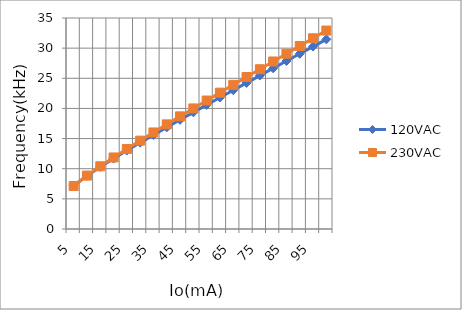
| Category | 120VAC | 230VAC |
|---|---|---|
| 5.0 | 7.177 | 7.134 |
| 10.0 | 8.828 | 8.86 |
| 15.0 | 10.298 | 10.405 |
| 20.0 | 11.683 | 11.866 |
| 25.0 | 13.018 | 13.277 |
| 30.0 | 14.32 | 14.657 |
| 35.0 | 15.599 | 16.014 |
| 40.0 | 16.861 | 17.354 |
| 45.0 | 18.111 | 18.683 |
| 50.0 | 19.35 | 20.001 |
| 55.0 | 20.581 | 21.312 |
| 60.0 | 21.806 | 22.616 |
| 65.0 | 23.025 | 23.915 |
| 70.0 | 24.239 | 25.21 |
| 75.0 | 25.45 | 26.501 |
| 80.0 | 26.657 | 27.789 |
| 85.0 | 27.861 | 29.074 |
| 90.0 | 29.063 | 30.357 |
| 95.0 | 30.263 | 31.638 |
| 100.0 | 31.46 | 32.917 |